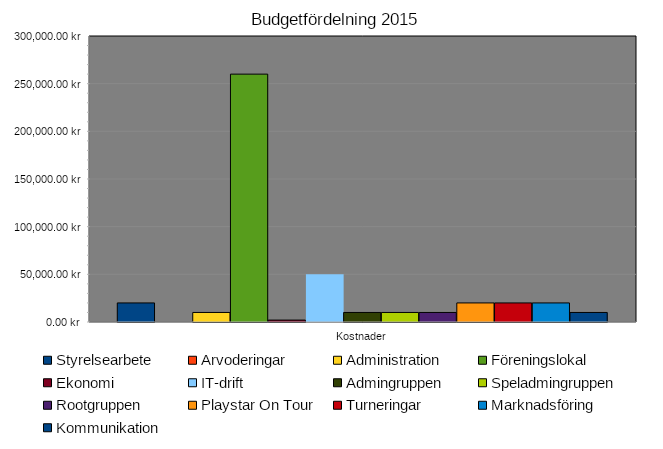
| Category | Styrelsearbete | Arvoderingar | Administration | Föreningslokal | Ekonomi | IT-drift | Admingruppen | Speladmingruppen | Rootgruppen | Playstar On Tour | Turneringar | Marknadsföring | Kommunikation |
|---|---|---|---|---|---|---|---|---|---|---|---|---|---|
| Kostnader | 20000 | 0 | 10000 | 260000 | 2000 | 50000 | 10000 | 10000 | 10000 | 20000 | 20000 | 20000 | 10000 |